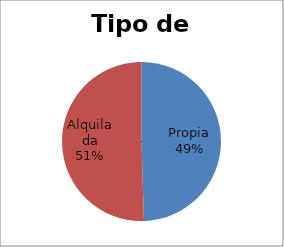
| Category | Series 0 |
|---|---|
| 0 | 198 |
| 1 | 202 |